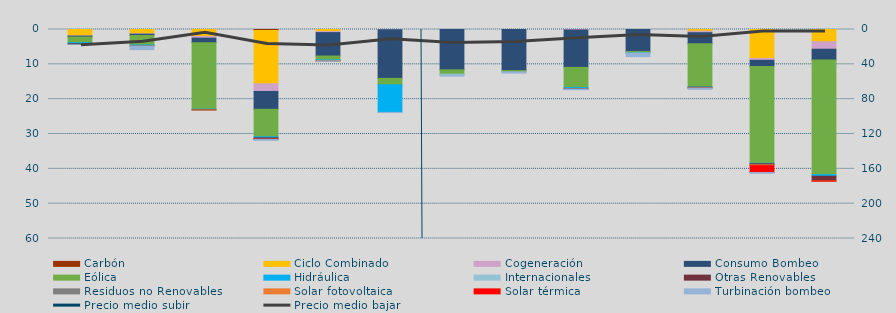
| Category | Carbón | Ciclo Combinado | Cogeneración | Consumo Bombeo | Eólica | Hidráulica | Internacionales | Otras Renovables | Residuos no Renovables | Solar fotovoltaica | Solar térmica | Turbinación bombeo |
|---|---|---|---|---|---|---|---|---|---|---|---|---|
| 0 | 0 | 1851.6 | 42.3 | 273.4 | 1634.9 | 310 | 0 | 3.7 | 0 | 0 | 0 | 0 |
| 1 | 0 | 1244.2 | 103.6 | 370.8 | 2746.7 | 304.8 | 0 | 15.4 | 0 | 0.1 | 0 | 1000.2 |
| 2 | 0 | 2003.8 | 480.6 | 1308.7 | 19069.4 | 129.7 | 0 | 113.5 | 0 | 2 | 0 | 0 |
| 3 | 274.3 | 15310.9 | 2199.5 | 5123.2 | 7894.3 | 324.4 | 0 | 365.6 | 0 | 33.3 | 39.3 | 259.1 |
| 4 | 0 | 600 | 290.9 | 6727.7 | 1121.1 | 272.6 | 0 | 7.6 | 12.5 | 0.4 | 0 | 84 |
| 5 | 0 | 0 | 66 | 13968.1 | 1844.7 | 7917.4 | 0 | 0 | 0 | 0 | 0 | 46.9 |
| 6 | 0 | 0 | 13.8 | 11574.5 | 1255.7 | 0 | 313 | 0 | 0 | 0 | 0 | 240.1 |
| 7 | 0 | 0 | 0 | 11798.2 | 360.9 | 0 | 0 | 0 | 0 | 0 | 0 | 358.6 |
| 8 | 0 | 0 | 132.9 | 10732.4 | 5808.3 | 350.7 | 0 | 98.7 | 0 | 2.1 | 0 | 152.1 |
| 9 | 0 | 0 | 0 | 6311.1 | 429.6 | 2 | 0 | 0 | 0 | 0 | 0 | 1049.5 |
| 10 | 0 | 520 | 398.7 | 3208 | 12396.3 | 41.7 | 0 | 256.7 | 0 | 0.8 | 0 | 340.4 |
| 11 | 0 | 8320.6 | 532.5 | 1797.8 | 27746.3 | 146.7 | 0 | 300.2 | 0 | 250.5 | 1972.6 | 219.1 |
| 12 | 0 | 3526.6 | 2136.1 | 3089.7 | 32928.1 | 457 | 0 | 1325.6 | 0 | 38.1 | 15 | 0 |